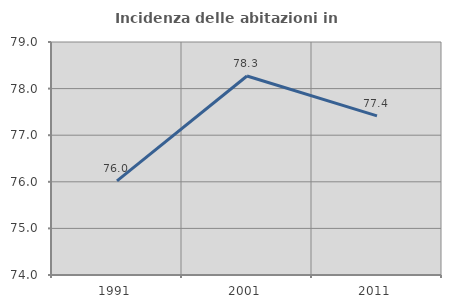
| Category | Incidenza delle abitazioni in proprietà  |
|---|---|
| 1991.0 | 76.019 |
| 2001.0 | 78.271 |
| 2011.0 | 77.414 |